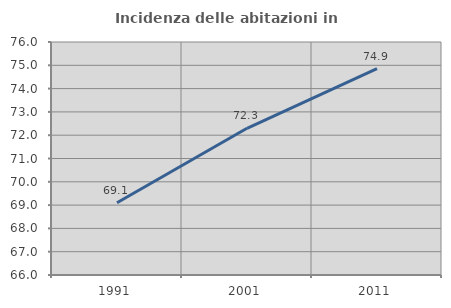
| Category | Incidenza delle abitazioni in proprietà  |
|---|---|
| 1991.0 | 69.1 |
| 2001.0 | 72.297 |
| 2011.0 | 74.858 |